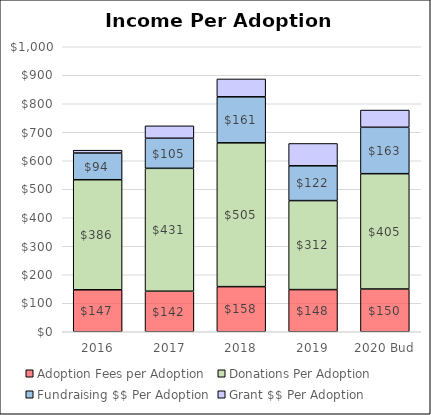
| Category | Adoption Fees per Adoption | Donations Per Adoption | Fundraising $$ Per Adoption | Grant $$ Per Adoption |
|---|---|---|---|---|
| 2016 | 147.217 | 386.197 | 93.628 | 10.064 |
| 2017 | 142.234 | 431.205 | 105.456 | 43.646 |
| 2018 | 158.241 | 504.69 | 161.421 | 62.763 |
| 2019 | 147.877 | 312.356 | 122.114 | 78.311 |
| 2020 Bud | 150 | 404.651 | 162.791 | 60.465 |